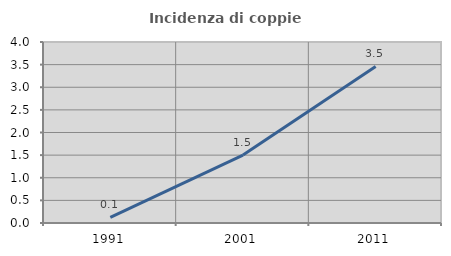
| Category | Incidenza di coppie miste |
|---|---|
| 1991.0 | 0.123 |
| 2001.0 | 1.502 |
| 2011.0 | 3.461 |